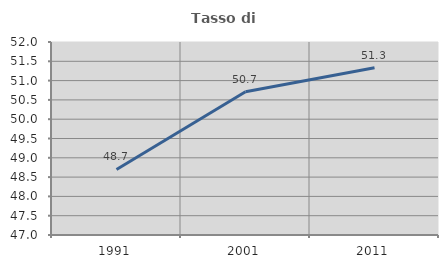
| Category | Tasso di occupazione   |
|---|---|
| 1991.0 | 48.699 |
| 2001.0 | 50.71 |
| 2011.0 | 51.335 |